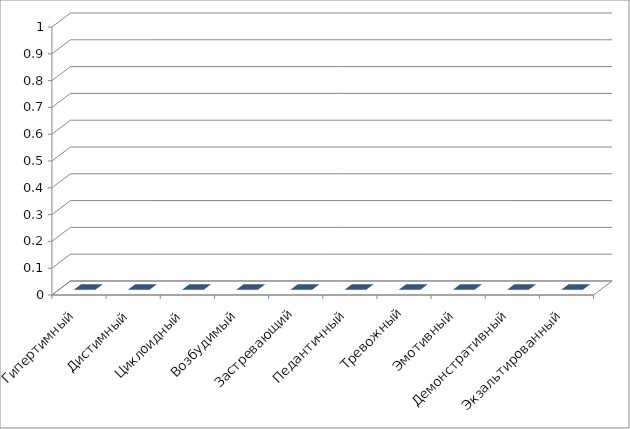
| Category | Series 0 |
|---|---|
| Гипертимный | 0 |
| Дистимный | 0 |
| Циклоидный | 0 |
| Возбудимый | 0 |
| Застревающий | 0 |
| Педантичный | 0 |
| Тревожный | 0 |
| Эмотивный | 0 |
| Демонстративный | 0 |
| Экзальтированный | 0 |